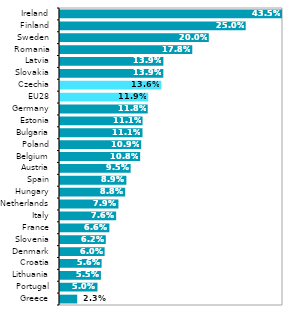
| Category | 2018* |
|---|---|
| Greece | 0.023 |
| Portugal | 0.05 |
| Lithuania | 0.055 |
| Croatia | 0.056 |
| Denmark | 0.06 |
| Slovenia | 0.062 |
| France | 0.066 |
| Italy | 0.076 |
| Netherlands | 0.079 |
| Hungary | 0.088 |
| Spain | 0.089 |
| Austria | 0.095 |
| Belgium | 0.108 |
| Poland | 0.109 |
| Bulgaria | 0.111 |
| Estonia | 0.111 |
| Germany | 0.118 |
| EU28 | 0.119 |
| Czechia | 0.136 |
| Slovakia | 0.139 |
| Latvia | 0.139 |
| Romania | 0.178 |
| Sweden | 0.2 |
| Finland | 0.25 |
| Ireland | 0.435 |